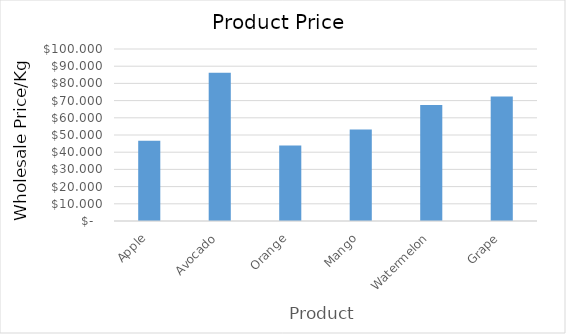
| Category | Series 0 |
|---|---|
| Apple | 46.726 |
| Avocado | 86.253 |
| Orange | 43.902 |
| Mango | 53.253 |
| Watermelon | 67.475 |
| Grape | 72.364 |